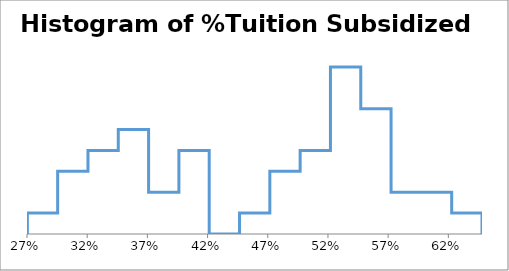
| Category | Series 0 |
|---|---|
| 0.2722866544249673 | 0 |
| 0.2722866544249673 | 1 |
| 0.2974649357764403 | 1 |
| 0.2974649357764403 | 3 |
| 0.3226432171279132 | 3 |
| 0.3226432171279132 | 4 |
| 0.3478214984793862 | 4 |
| 0.3478214984793862 | 5 |
| 0.3729997798308592 | 5 |
| 0.3729997798308592 | 2 |
| 0.3981780611823321 | 2 |
| 0.3981780611823321 | 4 |
| 0.4233563425338051 | 4 |
| 0.4233563425338051 | 0 |
| 0.4485346238852781 | 0 |
| 0.4485346238852781 | 1 |
| 0.473712905236751 | 1 |
| 0.473712905236751 | 3 |
| 0.49889118658822396 | 3 |
| 0.49889118658822396 | 4 |
| 0.5240694679396969 | 4 |
| 0.5240694679396969 | 8 |
| 0.5492477492911699 | 8 |
| 0.5492477492911699 | 6 |
| 0.574426030642643 | 6 |
| 0.574426030642643 | 2 |
| 0.5996043119941159 | 2 |
| 0.5996043119941159 | 2 |
| 0.6247825933455888 | 2 |
| 0.6247825933455888 | 1 |
| 0.6499608746970618 | 1 |
| 0.6499608746970618 | 0 |